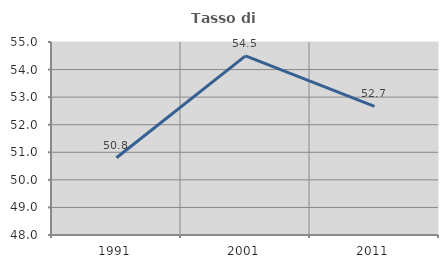
| Category | Tasso di occupazione   |
|---|---|
| 1991.0 | 50.803 |
| 2001.0 | 54.498 |
| 2011.0 | 52.668 |